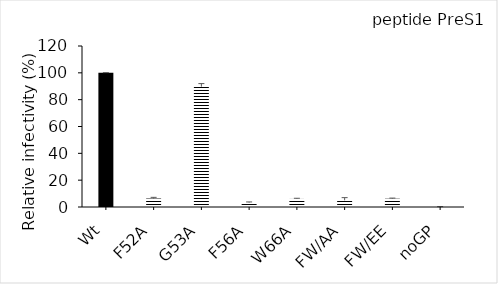
| Category | Series 0 |
|---|---|
| Wt | 100.062 |
| F52A | 6.297 |
| G53A | 89.691 |
| F56A | 3.297 |
| W66A | 6.01 |
| FW/AA | 4.963 |
| FW/EE | 6.162 |
| noGP | 0.176 |